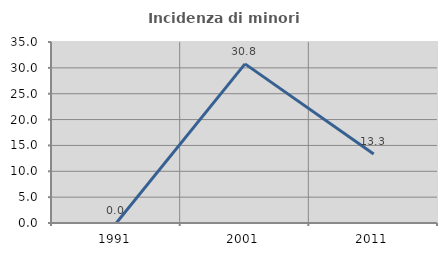
| Category | Incidenza di minori stranieri |
|---|---|
| 1991.0 | 0 |
| 2001.0 | 30.769 |
| 2011.0 | 13.333 |